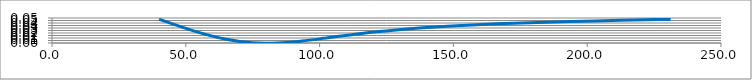
| Category | Series 0 |
|---|---|
| 40.0094 | 0.047 |
| 53.2045 | 0.024 |
| 64.5758 | 0.008 |
| 74.7571 | 0 |
| 84.2417 | 0 |
| 93.3746 | 0.004 |
| 102.37 | 0.01 |
| 111.345 | 0.016 |
| 120.354 | 0.022 |
| 129.415 | 0.027 |
| 138.53 | 0.031 |
| 147.691 | 0.034 |
| 156.888 | 0.036 |
| 166.114 | 0.038 |
| 175.362 | 0.04 |
| 184.629 | 0.042 |
| 193.911 | 0.043 |
| 203.209 | 0.044 |
| 212.522 | 0.045 |
| 221.851 | 0.046 |
| 231.197 | 0.047 |